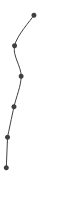
| Category | Series 0 |
|---|---|
| 0.4571978953930649 | 1 |
| 0.13898478729304 | 2 |
| 0.24714783013318956 | 3 |
| 0.12963004201479017 | 4 |
| 0.023757250788935647 | 5 |
| 0.0032498574316141365 | 6 |